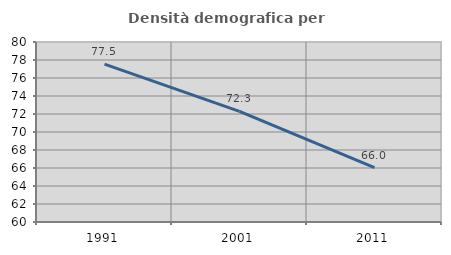
| Category | Densità demografica |
|---|---|
| 1991.0 | 77.533 |
| 2001.0 | 72.296 |
| 2011.0 | 66.041 |